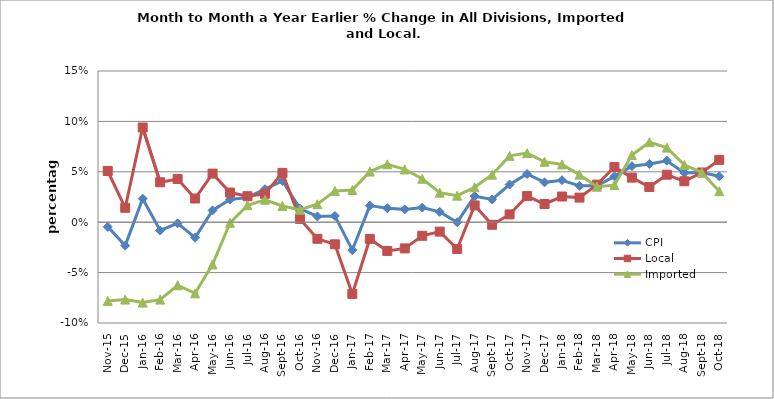
| Category | CPI | Local | Imported |
|---|---|---|---|
| 2015-11-01 | -0.005 | 0.051 | -0.078 |
| 2015-12-01 | -0.023 | 0.014 | -0.077 |
| 2016-01-01 | 0.023 | 0.094 | -0.08 |
| 2016-02-01 | -0.008 | 0.04 | -0.077 |
| 2016-03-01 | -0.001 | 0.043 | -0.063 |
| 2016-04-01 | -0.015 | 0.023 | -0.071 |
| 2016-05-01 | 0.012 | 0.048 | -0.042 |
| 2016-06-01 | 0.023 | 0.029 | -0.001 |
| 2016-07-01 | 0.025 | 0.026 | 0.017 |
| 2016-08-01 | 0.033 | 0.028 | 0.022 |
| 2016-09-01 | 0.041 | 0.049 | 0.016 |
| 2016-10-01 | 0.014 | 0.003 | 0.012 |
| 2016-11-01 | 0.006 | -0.016 | 0.018 |
| 2016-12-01 | 0.006 | -0.022 | 0.031 |
| 2017-01-01 | -0.028 | -0.071 | 0.032 |
| 2017-02-01 | 0.016 | -0.017 | 0.05 |
| 2017-03-01 | 0.014 | -0.029 | 0.057 |
| 2017-04-01 | 0.013 | -0.026 | 0.052 |
| 2017-05-01 | 0.015 | -0.013 | 0.043 |
| 2017-06-01 | 0.01 | -0.009 | 0.029 |
| 2017-07-01 | 0 | -0.027 | 0.026 |
| 2017-08-01 | 0.026 | 0.017 | 0.035 |
| 2017-09-01 | 0.023 | -0.003 | 0.047 |
| 2017-10-01 | 0.037 | 0.008 | 0.066 |
| 2017-11-01 | 0.048 | 0.026 | 0.069 |
| 2017-12-01 | 0.04 | 0.018 | 0.06 |
| 2018-01-01 | 0.042 | 0.025 | 0.057 |
| 2018-02-01 | 0.036 | 0.024 | 0.047 |
| 2018-03-01 | 0.036 | 0.037 | 0.035 |
| 2018-04-01 | 0.045 | 0.055 | 0.037 |
| 2018-05-01 | 0.056 | 0.044 | 0.067 |
| 2018-06-01 | 0.058 | 0.035 | 0.079 |
| 2018-07-01 | 0.061 | 0.047 | 0.074 |
| 2018-08-01 | 0.049 | 0.041 | 0.057 |
| 2018-09-01 | 0.049 | 0.049 | 0.049 |
| 2018-10-01 | 0.046 | 0.062 | 0.031 |